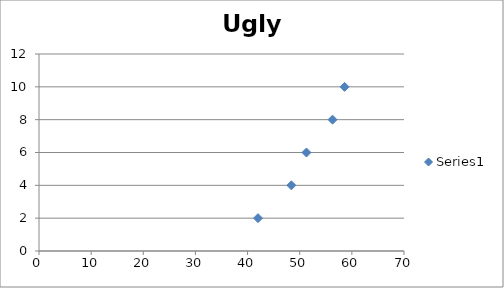
| Category | Series 0 |
|---|---|
| 42.0 | 2 |
| 48.4 | 4 |
| 51.3 | 6 |
| 56.3 | 8 |
| 58.6 | 10 |